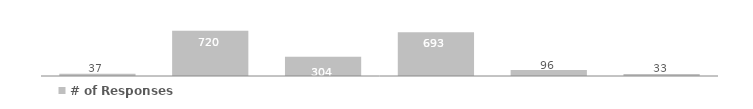
| Category | # of Responses |
|---|---|
| Africa | 37 |
| Asia | 720 |
| Europe | 304 |
| N. America | 693 |
| Oceania | 96 |
| S. America | 33 |